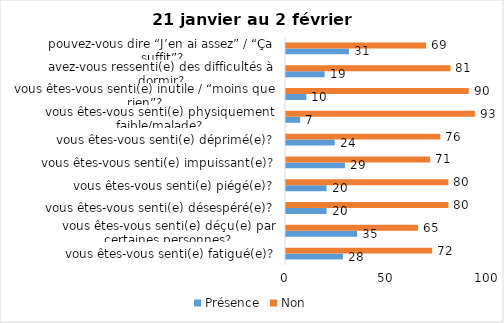
| Category | Présence | Non |
|---|---|---|
| vous êtes-vous senti(e) fatigué(e)? | 28 | 72 |
| vous êtes-vous senti(e) déçu(e) par certaines personnes? | 35 | 65 |
| vous êtes-vous senti(e) désespéré(e)? | 20 | 80 |
| vous êtes-vous senti(e) piégé(e)? | 20 | 80 |
| vous êtes-vous senti(e) impuissant(e)? | 29 | 71 |
| vous êtes-vous senti(e) déprimé(e)? | 24 | 76 |
| vous êtes-vous senti(e) physiquement faible/malade? | 7 | 93 |
| vous êtes-vous senti(e) inutile / “moins que rien”? | 10 | 90 |
| avez-vous ressenti(e) des difficultés à dormir? | 19 | 81 |
| pouvez-vous dire “J’en ai assez” / “Ça suffit”? | 31 | 69 |